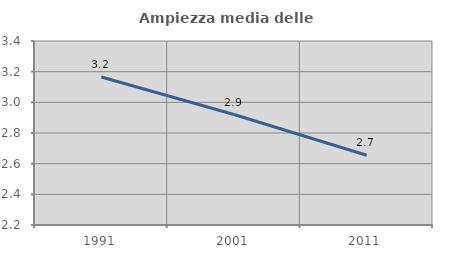
| Category | Ampiezza media delle famiglie |
|---|---|
| 1991.0 | 3.166 |
| 2001.0 | 2.921 |
| 2011.0 | 2.655 |